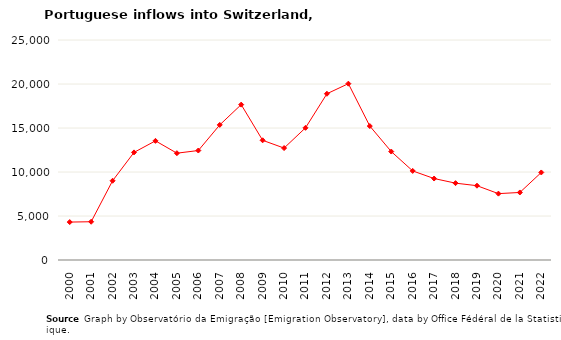
| Category | Entradas |
|---|---|
| 2000.0 | 4311 |
| 2001.0 | 4347 |
| 2002.0 | 9005 |
| 2003.0 | 12228 |
| 2004.0 | 13539 |
| 2005.0 | 12138 |
| 2006.0 | 12441 |
| 2007.0 | 15351 |
| 2008.0 | 17657 |
| 2009.0 | 13601 |
| 2010.0 | 12720 |
| 2011.0 | 15020 |
| 2012.0 | 18892 |
| 2013.0 | 20039 |
| 2014.0 | 15221 |
| 2015.0 | 12325 |
| 2016.0 | 10123 |
| 2017.0 | 9257 |
| 2018.0 | 8733 |
| 2019.0 | 8443 |
| 2020.0 | 7542 |
| 2021.0 | 7675 |
| 2022.0 | 9948 |